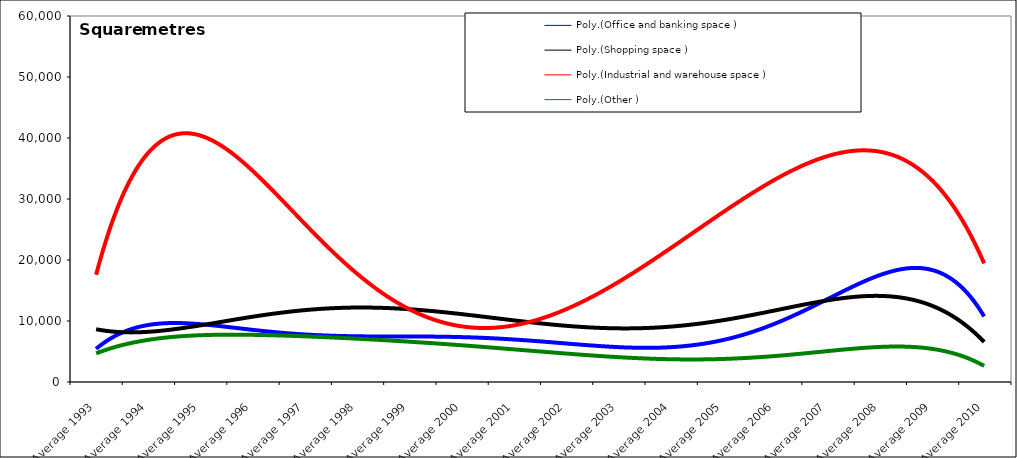
| Category | Office and banking space | Shopping space | Industrial and warehouse space | Other |
|---|---|---|---|---|
| Average 1993 | 3840.083 | 7911.75 | 19273.167 | 4569 |
| Average 1994 | 14243.75 | 9089 | 29577.667 | 7634.167 |
| Average 1995 | 5982.917 | 12454.333 | 51713.583 | 6208.583 |
| Average 1996 | 7401 | 6991.167 | 33714.917 | 8724.417 |
| Average 1997 | 8324.833 | 9341.167 | 19005.25 | 7786.417 |
| Average 1998 | 7065.167 | 8364.5 | 18962.167 | 6520.667 |
| Average 1999 | 9990.25 | 26515.833 | 8909.75 | 7421.75 |
| Average 2000 | 4690.667 | 7060.75 | 14173.083 | 4495.833 |
| Average 2001 | 11529.75 | 3186 | 11034 | 5105.417 |
| Average 2002 | 4412.583 | 10516.583 | 13680.167 | 7202.417 |
| Average 2003 | 2711.083 | 11288.083 | 14080.917 | 2677.583 |
| Average 2004 | 6691.417 | 7099.083 | 15809 | 3761.583 |
| Average 2005 | 5342.583 | 13125.25 | 30065.667 | 2859.917 |
| Average 2006 | 13978.25 | 9684.833 | 37507.5 | 4979.5 |
| Average 2007 | 10468 | 12652.167 | 32661.917 | 5926.75 |
| Average 2008 | 20702.417 | 16911.417 | 44614.75 | 4597.167 |
| Average 2009 | 15222.167 | 10115.917 | 26641.917 | 5877.083 |
| Average 2010 | 11582.833 | 7114 | 21045.5 | 2514.333 |